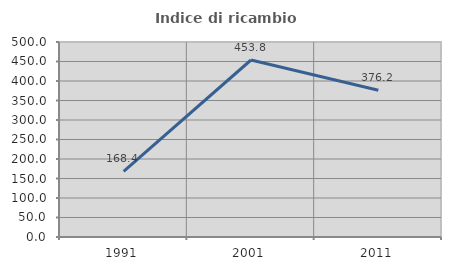
| Category | Indice di ricambio occupazionale  |
|---|---|
| 1991.0 | 168.421 |
| 2001.0 | 453.846 |
| 2011.0 | 376.19 |